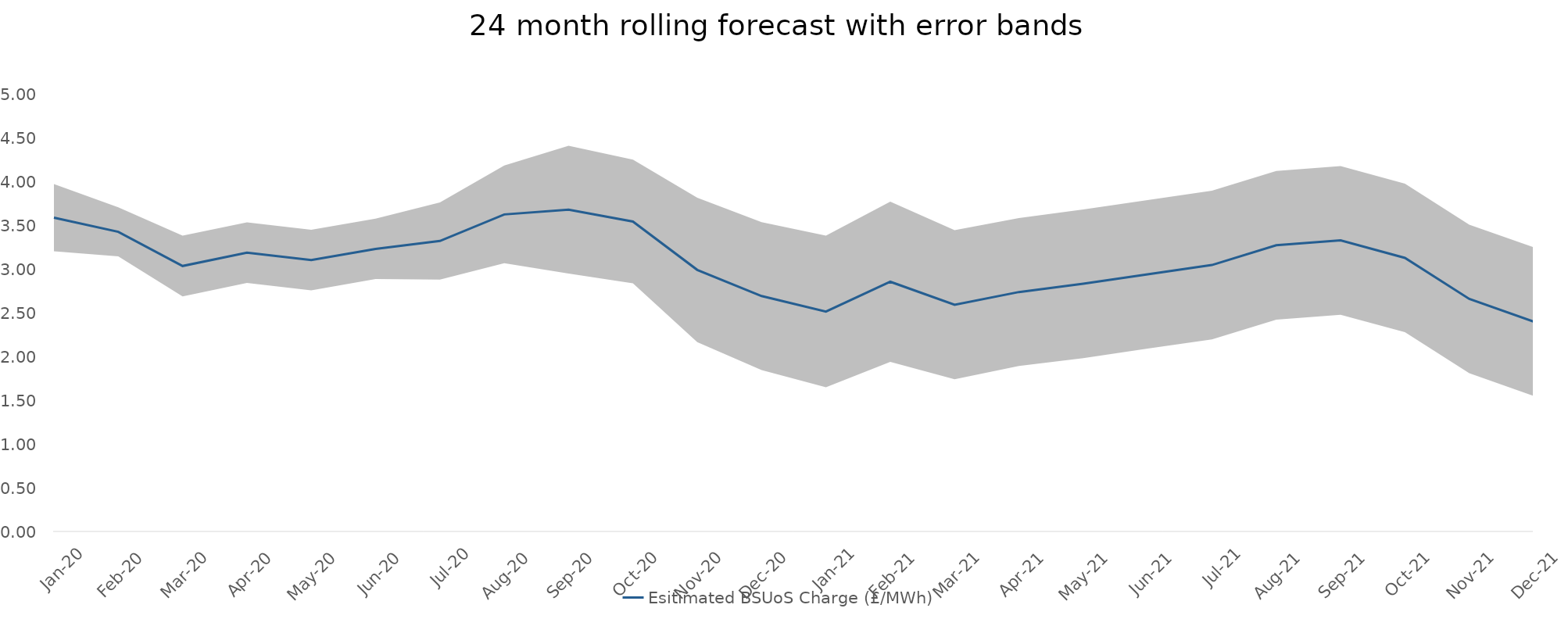
| Category | Esitimated BSUoS Charge (£/MWh) |
|---|---|
| Jan-20 | 3.591 |
| Feb-20 | 3.429 |
| Mar-20 | 3.038 |
| Apr-20 | 3.191 |
| May-20 | 3.106 |
| Jun-20 | 3.234 |
| Jul-20 | 3.325 |
| Aug-20 | 3.628 |
| Sep-20 | 3.683 |
| Oct-20 | 3.547 |
| Nov-20 | 2.994 |
| Dec-20 | 2.694 |
| Jan-21 | 2.517 |
| Feb-21 | 2.858 |
| Mar-21 | 2.594 |
| Apr-21 | 2.74 |
| May-21 | 2.835 |
| Jun-21 | 2.943 |
| Jul-21 | 3.05 |
| Aug-21 | 3.275 |
| Sep-21 | 3.331 |
| Oct-21 | 3.131 |
| Nov-21 | 2.661 |
| Dec-21 | 2.401 |